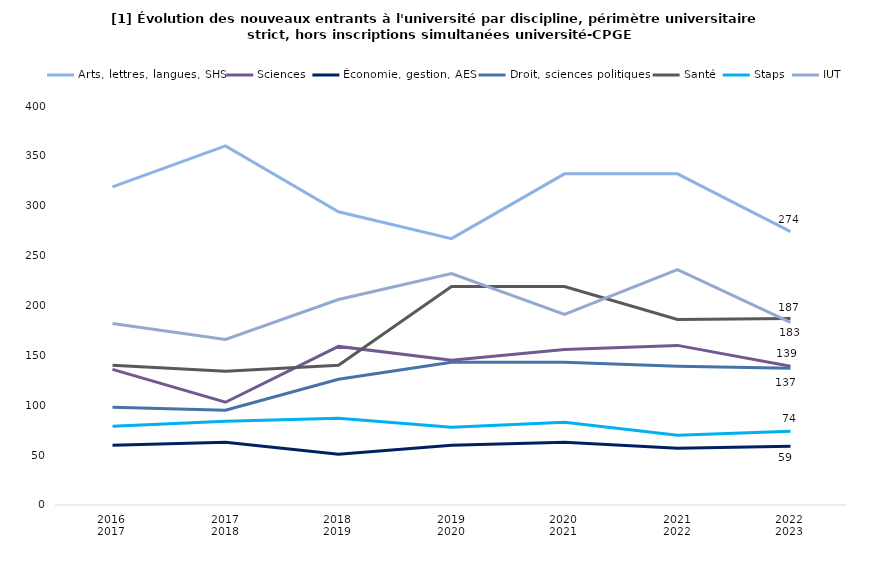
| Category | Arts, lettres, langues, SHS | Sciences | Économie, gestion, AES | Droit, sciences politiques | Santé | Staps | IUT |
|---|---|---|---|---|---|---|---|
| 2016
2017 | 319 | 136 | 60 | 98 | 140 | 79 | 182 |
| 2017
2018 | 360 | 103 | 63 | 95 | 134 | 84 | 166 |
| 2018
2019 | 294 | 159 | 51 | 126 | 140 | 87 | 206 |
| 2019
2020 | 267 | 145 | 60 | 143 | 219 | 78 | 232 |
| 2020
2021 | 332 | 156 | 63 | 143 | 219 | 83 | 191 |
| 2021
2022 | 332 | 160 | 57 | 139 | 186 | 70 | 236 |
| 2022
2023 | 274 | 139 | 59 | 137 | 187 | 74 | 183 |